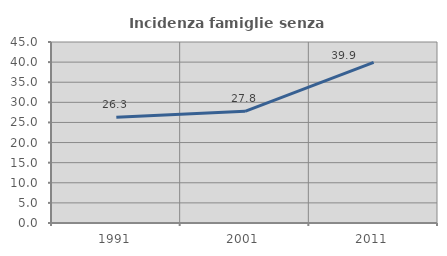
| Category | Incidenza famiglie senza nuclei |
|---|---|
| 1991.0 | 26.296 |
| 2001.0 | 27.758 |
| 2011.0 | 39.936 |